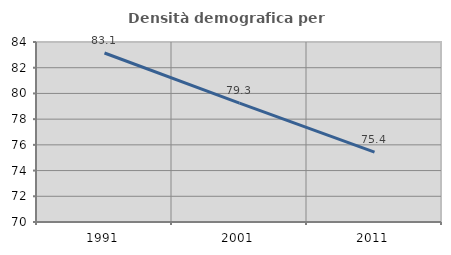
| Category | Densità demografica |
|---|---|
| 1991.0 | 83.143 |
| 2001.0 | 79.251 |
| 2011.0 | 75.442 |